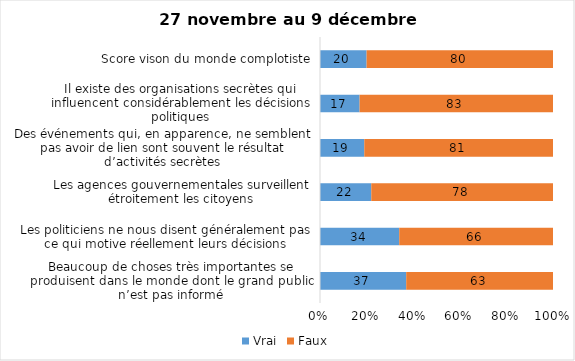
| Category | Vrai | Faux |
|---|---|---|
| Beaucoup de choses très importantes se produisent dans le monde dont le grand public n’est pas informé | 37 | 63 |
| Les politiciens ne nous disent généralement pas ce qui motive réellement leurs décisions | 34 | 66 |
| Les agences gouvernementales surveillent étroitement les citoyens | 22 | 78 |
| Des événements qui, en apparence, ne semblent pas avoir de lien sont souvent le résultat d’activités secrètes | 19 | 81 |
| Il existe des organisations secrètes qui influencent considérablement les décisions politiques | 17 | 83 |
| Score vison du monde complotiste | 20 | 80 |